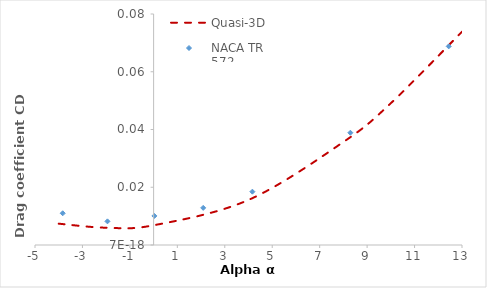
| Category | Quasi-3D |
|---|---|
| -4.0 | 0.007 |
| -2.0 | 0.006 |
| 0.0 | 0.007 |
| 4.0 | 0.016 |
| 8.0 | 0.036 |
| 10.0 | 0.049 |
| 13.0 | 0.074 |